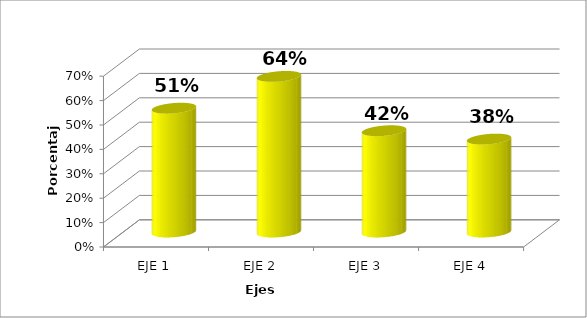
| Category | Series 0 |
|---|---|
| EJE 1 | 0.507 |
| EJE 2 | 0.638 |
| EJE 3 | 0.415 |
| EJE 4 | 0.381 |